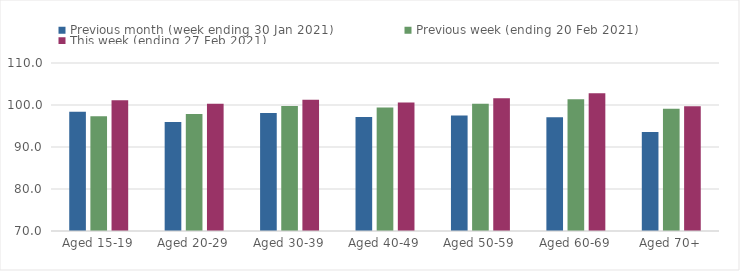
| Category | Previous month (week ending 30 Jan 2021) | Previous week (ending 20 Feb 2021) | This week (ending 27 Feb 2021) |
|---|---|---|---|
| Aged 15-19 | 98.41 | 97.34 | 101.12 |
| Aged 20-29 | 95.94 | 97.87 | 100.31 |
| Aged 30-39 | 98.11 | 99.78 | 101.26 |
| Aged 40-49 | 97.13 | 99.39 | 100.6 |
| Aged 50-59 | 97.5 | 100.3 | 101.6 |
| Aged 60-69 | 97.11 | 101.37 | 102.82 |
| Aged 70+ | 93.58 | 99.13 | 99.73 |